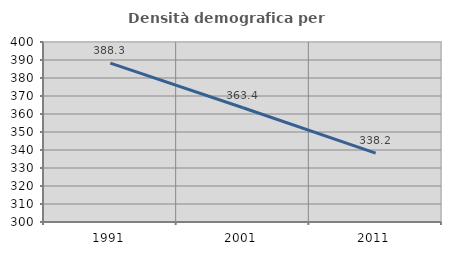
| Category | Densità demografica |
|---|---|
| 1991.0 | 388.291 |
| 2001.0 | 363.448 |
| 2011.0 | 338.237 |